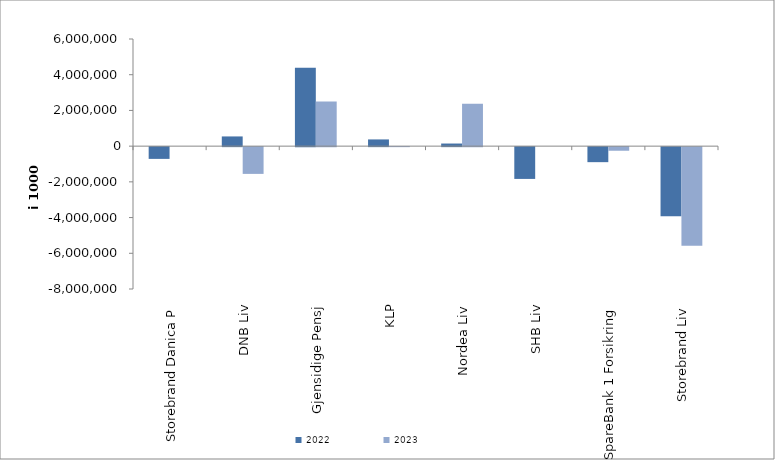
| Category | 2022 | 2023 |
|---|---|---|
| Storebrand Danica P | -657818.064 | 0 |
| DNB Liv | 543730.59 | -1498044 |
| Gjensidige Pensj | 4386610 | 2502352 |
| KLP | 376337.441 | 81.662 |
| Nordea Liv | 146328.869 | 2370630.325 |
| SHB Liv | -1779753.458 | 0 |
| SpareBank 1 Forsikring | -840940 | -201912.617 |
| Storebrand Liv | -3868648.264 | -5526279.834 |